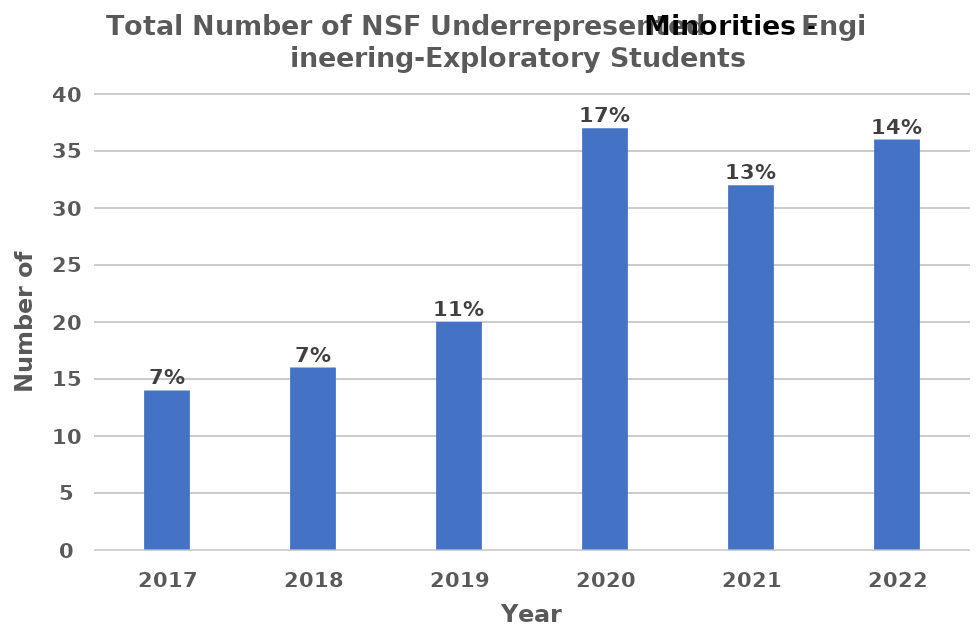
| Category | Total Number of NSF Underrepresented Engineering-Exploratory Students |
|---|---|
| 2017.0 | 14 |
| 2018.0 | 16 |
| 2019.0 | 20 |
| 2020.0 | 37 |
| 2021.0 | 32 |
| 2022.0 | 36 |